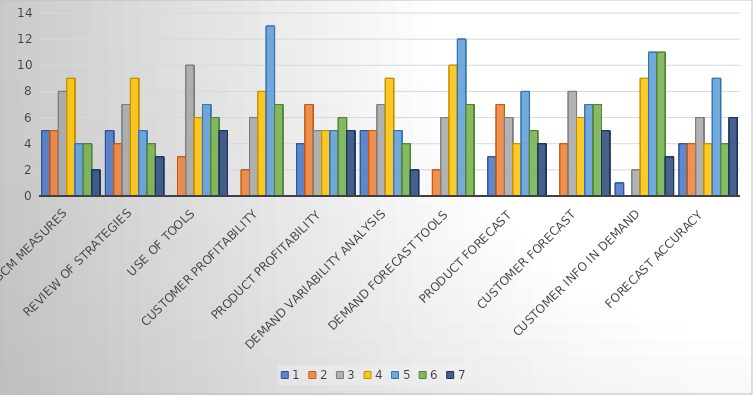
| Category | 1 | 2 | 3 | 4 | 5 | 6 | 7 |
|---|---|---|---|---|---|---|---|
| SCM measures | 5 | 5 | 8 | 9 | 4 | 4 | 2 |
| Review of strategies | 5 | 4 | 7 | 9 | 5 | 4 | 3 |
| Use of tools | 0 | 3 | 10 | 6 | 7 | 6 | 5 |
| Customer profitability | 0 | 2 | 6 | 8 | 13 | 7 | 0 |
| Product profitability | 4 | 7 | 5 | 5 | 5 | 6 | 5 |
| Demand variability analysis | 5 | 5 | 7 | 9 | 5 | 4 | 2 |
| Demand forecast tools | 0 | 2 | 6 | 10 | 12 | 7 | 0 |
| Product forecast | 3 | 7 | 6 | 4 | 8 | 5 | 4 |
| Customer forecast | 0 | 4 | 8 | 6 | 7 | 7 | 5 |
| Customer info in demand | 1 | 0 | 2 | 9 | 11 | 11 | 3 |
| Forecast accuracy | 4 | 4 | 6 | 4 | 9 | 4 | 6 |